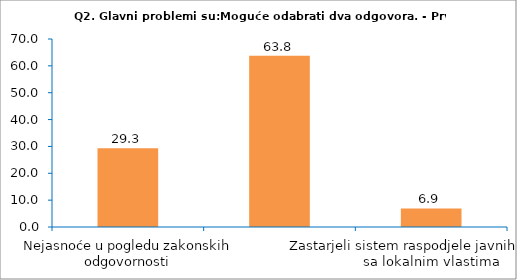
| Category | Series 0 |
|---|---|
| Nejasnoće u pogledu zakonskih odgovornosti | 29.31 |
| Nedovoljno izdvajanje finansijskih sredstava za zakonski dodijeljene nadležnosti | 63.793 |
| Zastarjeli sistem raspodjele javnih prihoda sa lokalnim vlastima | 6.897 |